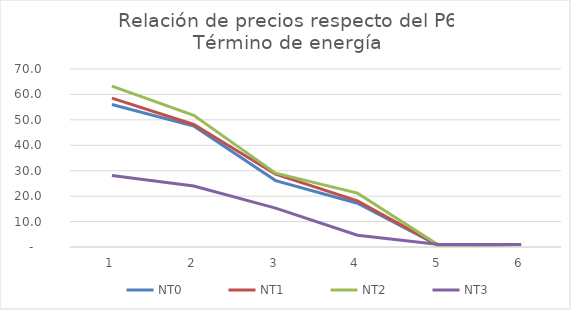
| Category | NT0 | NT1 | NT2 | NT3 |
|---|---|---|---|---|
| 0 | 56.042 | 58.529 | 63.233 | 28.083 |
| 1 | 47.578 | 48.195 | 51.768 | 24.016 |
| 2 | 26.111 | 28.609 | 29.016 | 15.292 |
| 3 | 17.223 | 18.151 | 21.183 | 4.634 |
| 4 | 0.427 | 0.418 | 0.624 | 0.961 |
| 5 | 1 | 1 | 1 | 1 |